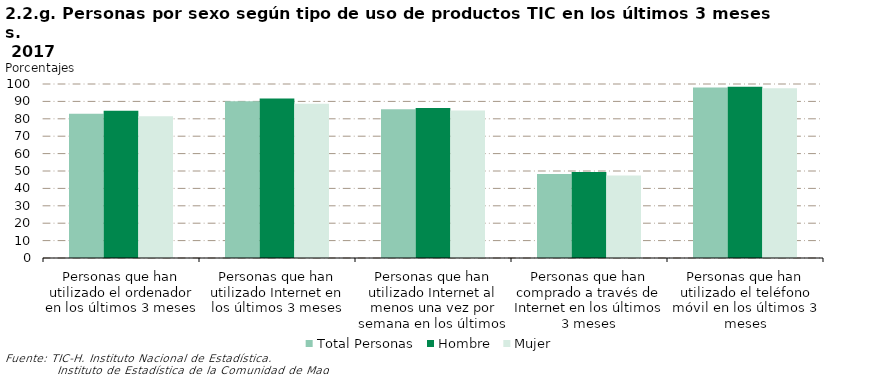
| Category | Total Personas | Hombre | Mujer |
|---|---|---|---|
| Personas que han utilizado el ordenador en los últimos 3 meses | 82.958 | 84.624 | 81.403 |
| Personas que han utilizado Internet en los últimos 3 meses | 90.049 | 91.615 | 88.588 |
| Personas que han utilizado Internet al menos una vez por semana en los últimos 3 meses | 85.516 | 86.278 | 84.804 |
| Personas que han comprado a través de Internet en los últimos 3 meses | 48.338 | 49.354 | 47.39 |
| Personas que han utilizado el teléfono móvil en los últimos 3 meses | 97.998 | 98.415 | 97.609 |